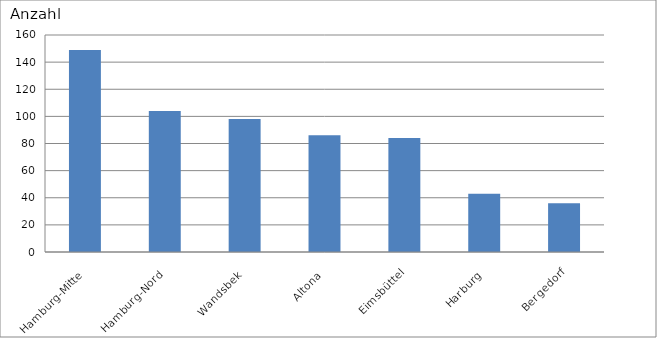
| Category | Hamburg-Mitte |
|---|---|
| Hamburg-Mitte | 149 |
| Hamburg-Nord | 104 |
| Wandsbek | 98 |
| Altona | 86 |
| Eimsbüttel | 84 |
| Harburg | 43 |
| Bergedorf | 36 |